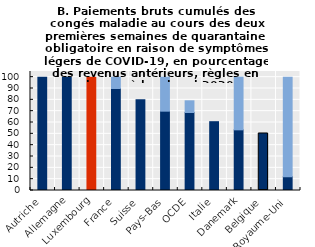
| Category | Versements obligatoires | Versement non obligatoire employeur | Versements obligatoires de base |
|---|---|---|---|
| Autriche | 100 | 0 |  |
| Allemagne | 100 | 0 |  |
| Luxembourg | 100 | 0 |  |
| France | 90 | 10 |  |
| Suisse | 80 | 0 |  |
| Pays-Bas | 70 | 30 |  |
| OCDE | 68.836 | 10.311 |  |
| Italie | 60.714 | 0 |  |
| Danemark | 53.531 | 46.469 |  |
| Belgique | 50.318 | 0 |  |
| Royaume-Uni | 12.215 | 87.785 |  |